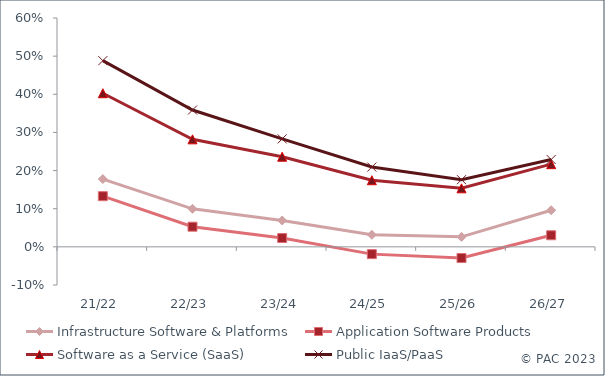
| Category | Infrastructure Software & Platforms | Application Software Products | Software as a Service (SaaS) | Public IaaS/PaaS |
|---|---|---|---|---|
| 21/22 | 0.178 | 0.133 | 0.403 | 0.488 |
| 22/23 | 0.1 | 0.053 | 0.282 | 0.359 |
| 23/24 | 0.069 | 0.023 | 0.236 | 0.283 |
| 24/25 | 0.032 | -0.019 | 0.175 | 0.209 |
| 25/26 | 0.026 | -0.029 | 0.153 | 0.176 |
| 26/27 | 0.096 | 0.03 | 0.217 | 0.229 |